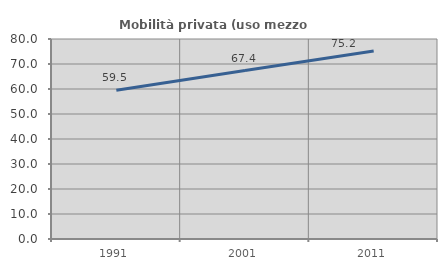
| Category | Mobilità privata (uso mezzo privato) |
|---|---|
| 1991.0 | 59.504 |
| 2001.0 | 67.391 |
| 2011.0 | 75.243 |